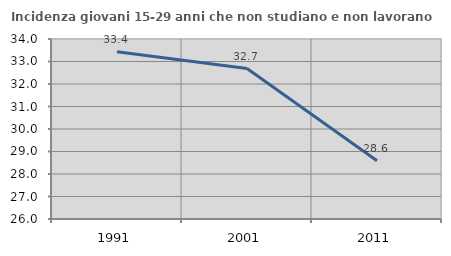
| Category | Incidenza giovani 15-29 anni che non studiano e non lavorano  |
|---|---|
| 1991.0 | 33.435 |
| 2001.0 | 32.686 |
| 2011.0 | 28.59 |